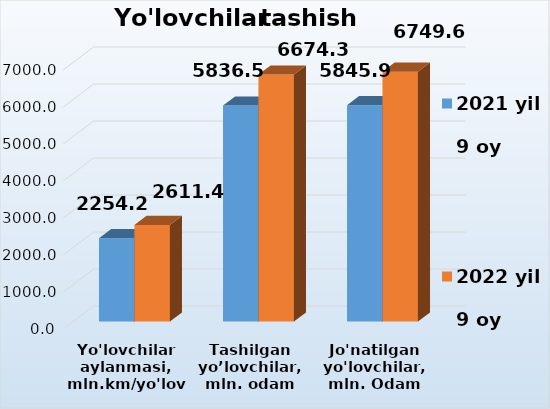
| Category | 2021 yil    
9 oy | 2022 yil    
9 oy |
|---|---|---|
| Yo'lovchilar aylanmasi, mln.km/yo'lovchi | 2254.2 | 2611.4 |
| Tashilgan yo’lovchilar, mln. odam | 5836.5 | 6674.3 |
| Jo'natilgan yo'lovchilar, mln. Odam | 5845.9 | 6749.6 |